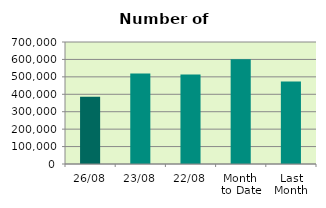
| Category | Series 0 |
|---|---|
| 26/08 | 386078 |
| 23/08 | 518986 |
| 22/08 | 513692 |
| Month 
to Date | 600930.333 |
| Last
Month | 472929.565 |